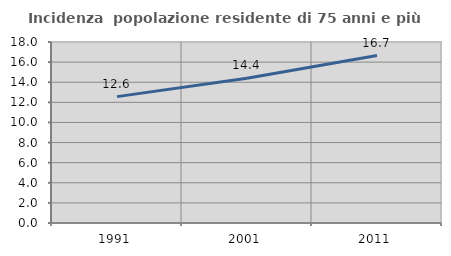
| Category | Incidenza  popolazione residente di 75 anni e più |
|---|---|
| 1991.0 | 12.567 |
| 2001.0 | 14.398 |
| 2011.0 | 16.652 |